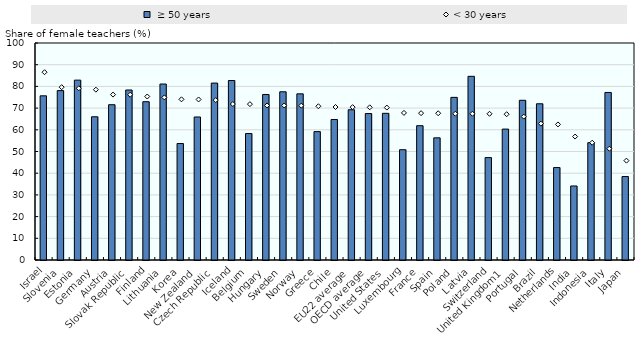
| Category |  ≥ 50 years |
|---|---|
| Israel | 75.652 |
| Slovenia | 78.063 |
| Estonia | 82.889 |
| Germany | 66.004 |
| Austria | 71.558 |
| Slovak Republic | 78.342 |
| Finland | 72.942 |
| Lithuania | 81.09 |
| Korea | 53.673 |
| New Zealand | 65.899 |
| Czech Republic | 81.526 |
| Iceland | 82.724 |
| Belgium | 58.275 |
| Hungary | 76.269 |
| Sweden | 77.516 |
| Norway | 76.567 |
| Greece | 59.16 |
| Chile | 64.733 |
| EU22 average | 69.244 |
| OECD average | 67.496 |
| United States | 67.597 |
| Luxembourg | 50.82 |
| France | 61.892 |
| Spain | 56.296 |
| Poland | 74.946 |
| Latvia | 84.642 |
| Switzerland | 47.187 |
| United Kingdom1 | 60.33 |
| Portugal | 73.601 |
| Brazil | 71.995 |
| Netherlands | 42.605 |
| India | 34.116 |
| Indonesia | 54.067 |
| Italy | 77.21 |
| Japan | 38.464 |